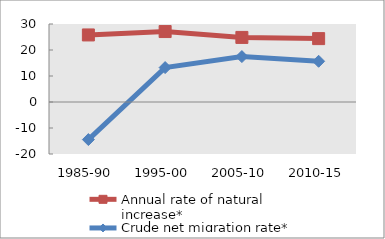
| Category | Annual rate of natural increase* | Crude net migration rate* |
|---|---|---|
| 1985-90 | 25.789 | -14.451 |
| 1995-00 | 27.093 | 13.237 |
| 2005-10 | 24.84 | 17.464 |
| 2010-15 | 24.376 | 15.661 |